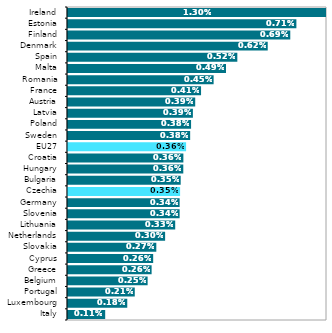
| Category | Series 0 |
|---|---|
| Italy | 0.001 |
| Luxembourg | 0.002 |
| Portugal | 0.002 |
| Belgium | 0.002 |
| Greece | 0.003 |
| Cyprus | 0.003 |
| Slovakia | 0.003 |
| Netherlands | 0.003 |
| Lithuania | 0.003 |
| Slovenia | 0.003 |
| Germany | 0.003 |
| Czechia | 0.003 |
| Bulgaria | 0.003 |
| Hungary | 0.004 |
| Croatia | 0.004 |
| EU27 | 0.004 |
| Sweden | 0.004 |
| Poland | 0.004 |
| Latvia | 0.004 |
| Austria | 0.004 |
| France | 0.004 |
| Romania | 0.004 |
| Malta | 0.005 |
| Spain | 0.005 |
| Denmark | 0.006 |
| Finland | 0.007 |
| Estonia | 0.007 |
| Ireland | 0.013 |